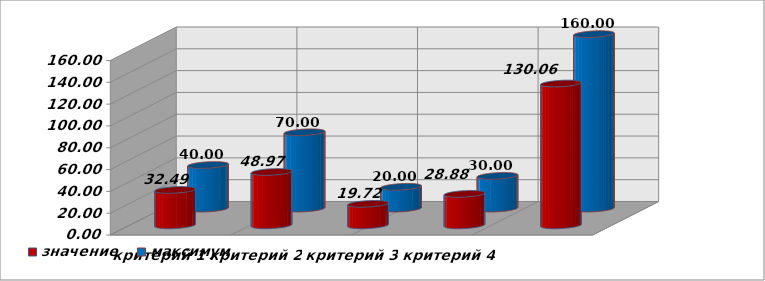
| Category | значение | максимум |
|---|---|---|
| критерий 1 | 32.49 | 40 |
| критерий 2 | 48.97 | 70 |
| критерий 3 | 19.72 | 20 |
| критерий 4 | 28.88 | 30 |